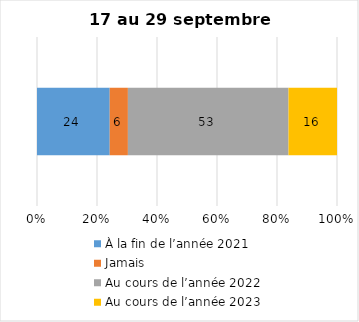
| Category | À la fin de l’année 2021 | Jamais | Au cours de l’année 2022 | Au cours de l’année 2023 |
|---|---|---|---|---|
| 0 | 24 | 6 | 53 | 16 |